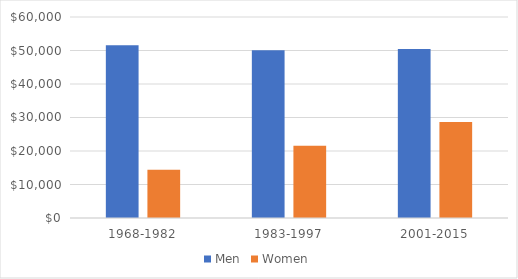
| Category | Men | Women |
|---|---|---|
| 1968-1982 | 51575 | 14379 |
| 1983-1997 | 50044 | 21574 |
| 2001-2015 | 50442 | 28683 |